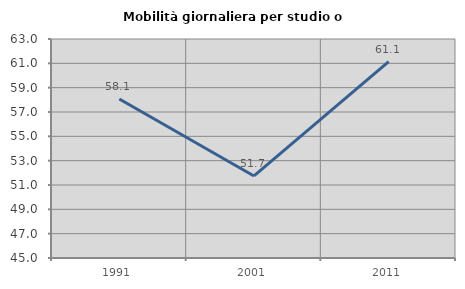
| Category | Mobilità giornaliera per studio o lavoro |
|---|---|
| 1991.0 | 58.065 |
| 2001.0 | 51.741 |
| 2011.0 | 61.135 |